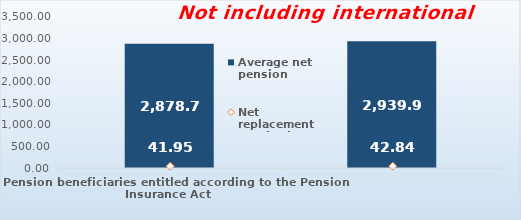
| Category | Average net pension  |
|---|---|
| Pension beneficiaries entitled according to the Pension Insurance Act   | 2878.72 |
| Pension beneficiaries entitled to pension FOR THE FIRST TIME in 2020 according to the Pension Insurance Act  - NEW BENEFICIARIES | 2939.948 |